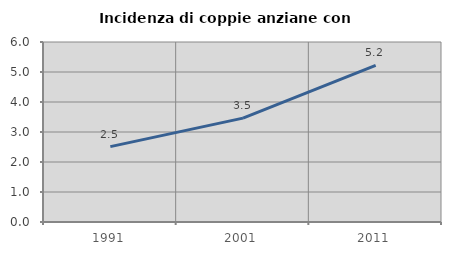
| Category | Incidenza di coppie anziane con figli |
|---|---|
| 1991.0 | 2.513 |
| 2001.0 | 3.462 |
| 2011.0 | 5.221 |